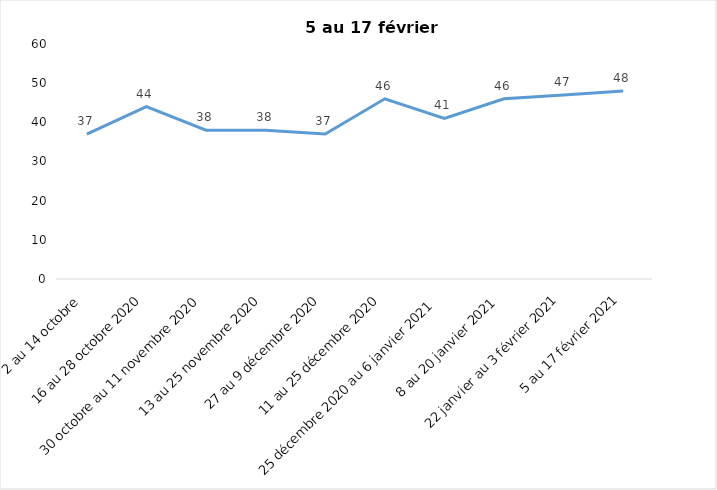
| Category | Toujours aux trois mesures |
|---|---|
| 2 au 14 octobre  | 37 |
| 16 au 28 octobre 2020 | 44 |
| 30 octobre au 11 novembre 2020 | 38 |
| 13 au 25 novembre 2020 | 38 |
| 27 au 9 décembre 2020 | 37 |
| 11 au 25 décembre 2020 | 46 |
| 25 décembre 2020 au 6 janvier 2021 | 41 |
| 8 au 20 janvier 2021 | 46 |
| 22 janvier au 3 février 2021 | 47 |
| 5 au 17 février 2021 | 48 |